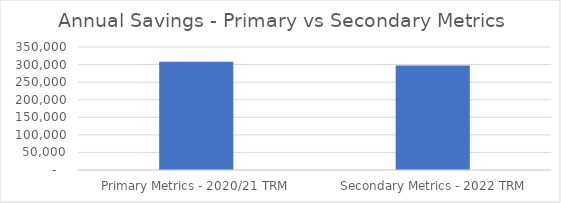
| Category | Series 0 |
|---|---|
|  Primary Metrics - 2020/21 TRM  | 307805.642 |
|  Secondary Metrics - 2022 TRM  | 297037.165 |